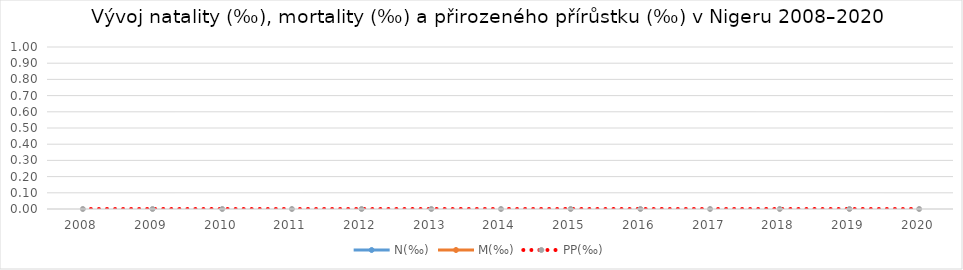
| Category | N(‰) | M(‰) | PP(‰) |
|---|---|---|---|
| 2008.0 |  |  | 0 |
| 2009.0 |  |  | 0 |
| 2010.0 |  |  | 0 |
| 2011.0 |  |  | 0 |
| 2012.0 |  |  | 0 |
| 2013.0 |  |  | 0 |
| 2014.0 |  |  | 0 |
| 2015.0 |  |  | 0 |
| 2016.0 |  |  | 0 |
| 2017.0 |  |  | 0 |
| 2018.0 |  |  | 0 |
| 2019.0 |  |  | 0 |
| 2020.0 |  |  | 0 |